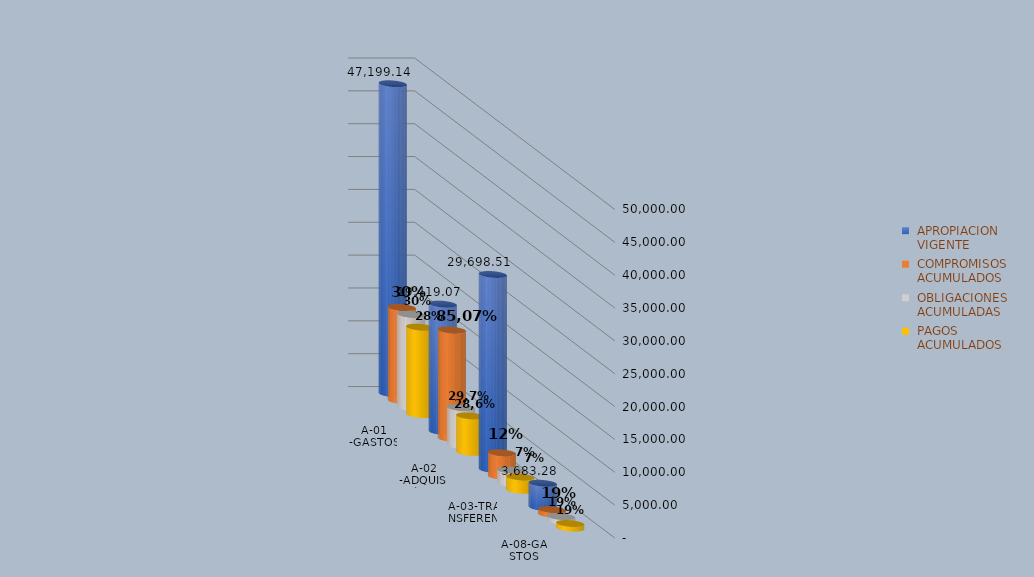
| Category |  APROPIACION
 VIGENTE |  COMPROMISOS
 ACUMULADOS |  OBLIGACIONES
 ACUMULADAS |  PAGOS
 ACUMULADOS |
|---|---|---|---|---|
| A-01 -GASTOS DE PERSONAL | 47199.142 | 14201.368 | 14201.368 | 13292.613 |
| A-02 -ADQUISICIÓN DE BIENES  Y SERVICIOS | 19419.071 | 16520.111 | 5766.136 | 5549.616 |
| A-03-TRANSFERENCIAS CORRIENTES | 29698.508 | 3607.935 | 2014.634 | 2014.634 |
| A-08-GASTOS POR TRIBUTOS, MULTAS, SANCIONES E INTERESES DE MORA | 3683.28 | 702.488 | 702.488 | 702.488 |